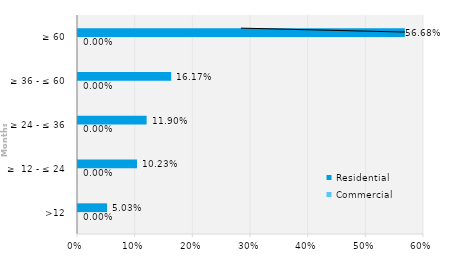
| Category | Commercial | Residential |
|---|---|---|
| >12 | 0 | 0.05 |
| ≥  12 - ≤ 24 | 0 | 0.102 |
| ≥ 24 - ≤ 36 | 0 | 0.119 |
| ≥ 36 - ≤ 60 | 0 | 0.162 |
| ≥ 60 | 0 | 0.567 |